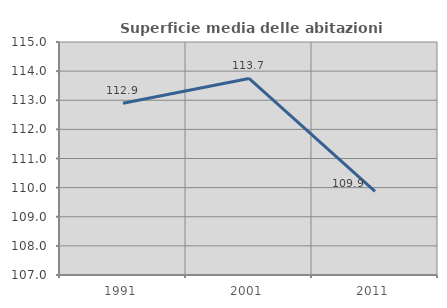
| Category | Superficie media delle abitazioni occupate |
|---|---|
| 1991.0 | 112.895 |
| 2001.0 | 113.748 |
| 2011.0 | 109.875 |